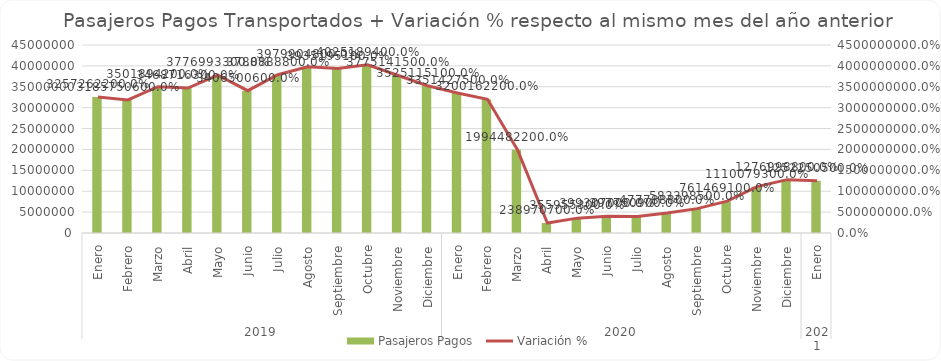
| Category | Pasajeros Pagos |
|---|---|
| 0 | 32572622 |
| 1 | 31857506 |
| 2 | 35018942 |
| 3 | 34687163 |
| 4 | 37769933 |
| 5 | 34065006 |
| 6 | 37888888 |
| 7 | 39799048 |
| 8 | 39351951 |
| 9 | 40251894 |
| 10 | 37751415 |
| 11 | 35251151 |
| 12 | 33514275 |
| 13 | 32001622 |
| 14 | 19944822 |
| 15 | 2389707 |
| 16 | 3559553 |
| 17 | 3993070 |
| 18 | 3977909 |
| 19 | 4777888 |
| 20 | 5833985 |
| 21 | 7614691 |
| 22 | 11100793 |
| 23 | 12769988 |
| 24 | 12522505 |